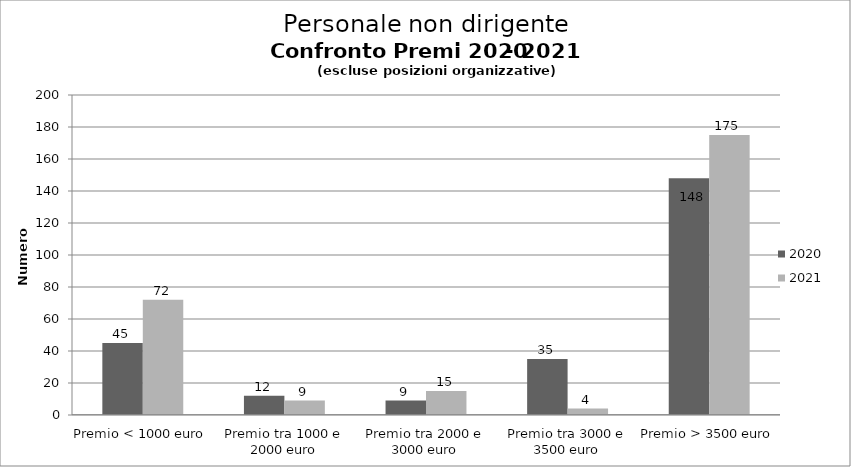
| Category | 2020 | 2021 |
|---|---|---|
| Premio < 1000 euro | 45 | 72 |
| Premio tra 1000 e 2000 euro | 12 | 9 |
| Premio tra 2000 e 3000 euro | 9 | 15 |
| Premio tra 3000 e 3500 euro | 35 | 4 |
| Premio > 3500 euro | 148 | 175 |